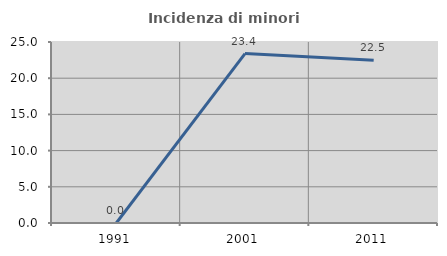
| Category | Incidenza di minori stranieri |
|---|---|
| 1991.0 | 0 |
| 2001.0 | 23.404 |
| 2011.0 | 22.476 |